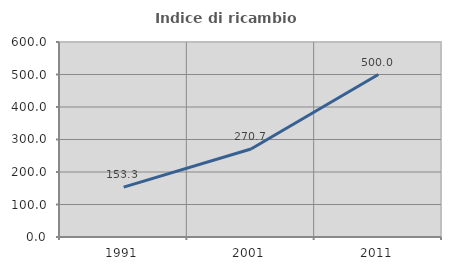
| Category | Indice di ricambio occupazionale  |
|---|---|
| 1991.0 | 153.333 |
| 2001.0 | 270.732 |
| 2011.0 | 500 |